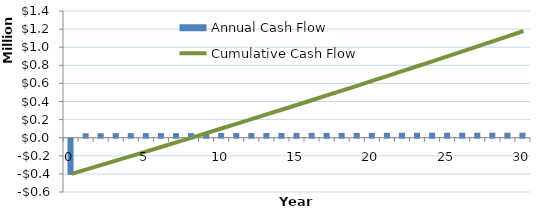
| Category | Annual Cash Flow |
|---|---|
| 0.0 | -400000 |
| 1.0 | 49498.74 |
| 2.0 | 49697.544 |
| 3.0 | 49898.427 |
| 4.0 | 50101.101 |
| 5.0 | 50305.583 |
| 6.0 | 50511.887 |
| 7.0 | 50720.027 |
| 8.0 | 50930.02 |
| 9.0 | 51141.88 |
| 10.0 | 51355.623 |
| 11.0 | 51571.264 |
| 12.0 | 51788.818 |
| 13.0 | 52008.301 |
| 14.0 | 52229.728 |
| 15.0 | 52453.117 |
| 16.0 | 52678.481 |
| 17.0 | 52905.838 |
| 18.0 | 53135.203 |
| 19.0 | 53366.594 |
| 20.0 | 53600.025 |
| 21.0 | 53835.513 |
| 22.0 | 54073.076 |
| 23.0 | 54312.729 |
| 24.0 | 54554.49 |
| 25.0 | 54798.374 |
| 26.0 | 55044.4 |
| 27.0 | 55292.584 |
| 28.0 | 55542.944 |
| 29.0 | 55795.496 |
| 30.0 | 56050.258 |